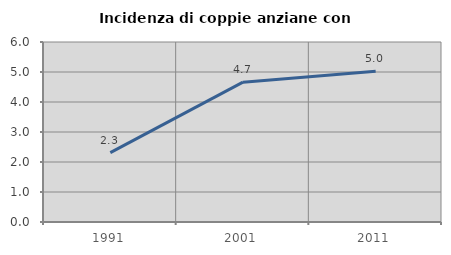
| Category | Incidenza di coppie anziane con figli |
|---|---|
| 1991.0 | 2.314 |
| 2001.0 | 4.662 |
| 2011.0 | 5.027 |